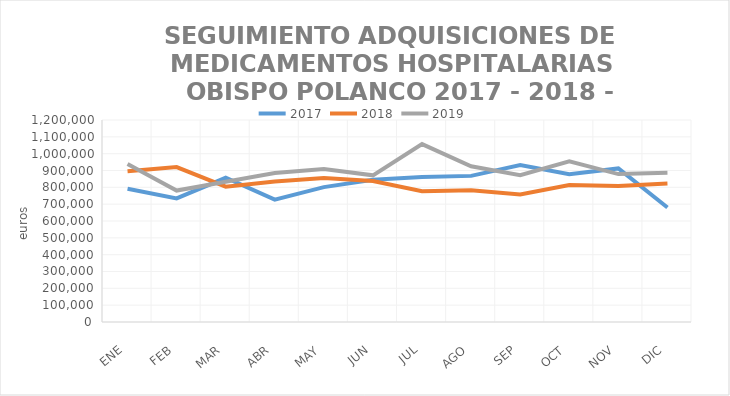
| Category | 2017 | 2018 | 2019 |
|---|---|---|---|
| ENE | 791901.57 | 894856.1 | 938241.33 |
| FEB | 734055.87 | 920460.06 | 780963.72 |
| MAR | 856700.45 | 803853.42 | 832663.51 |
| ABR | 726937.6 | 835284.72 | 885299.37 |
| MAY | 801373.36 | 855667.75 | 909426.51 |
| JUN | 845505.32 | 837621.39 | 871210.01 |
| JUL | 861170.35 | 776713.61 | 1056899.53 |
| AGO | 868063.8 | 782116.01 | 924718.4 |
| SEP | 931930.42 | 757299.69 | 872063.9 |
| OCT | 877602.06 | 813760.92 | 954973.97 |
| NOV | 912403.66 | 808579.86 | 878833.71 |
| DIC | 680292.56 | 823006.17 | 886551.68 |